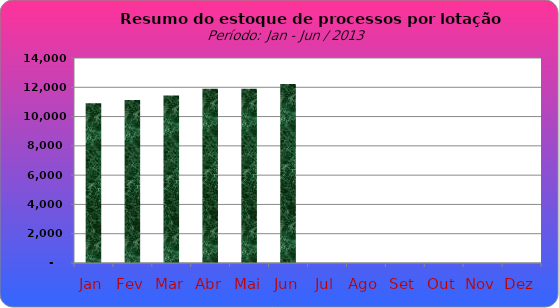
| Category | Series 0 |
|---|---|
| Jan | 10909 |
| Fev | 11131 |
| Mar | 11446 |
| Abr | 11893 |
| Mai | 11901 |
| Jun | 12228 |
| Jul | 0 |
| Ago | 0 |
| Set | 0 |
| Out | 0 |
| Nov | 0 |
| Dez | 0 |